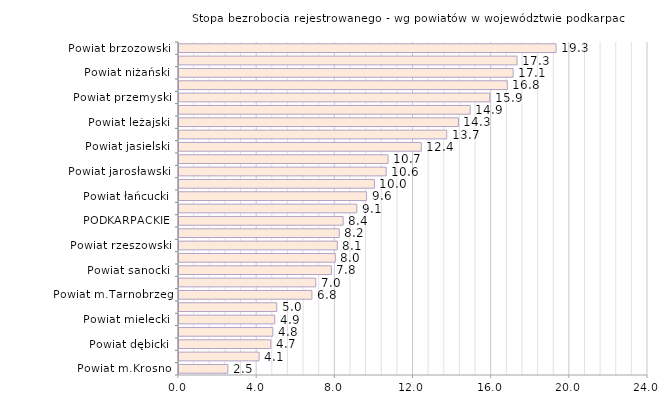
| Category | Stopa bezrobocia rejestrowanego - wg powiatów w województwie podkarpackim |
|---|---|
| Powiat m.Krosno | 2.5 |
| Powiat m.Rzeszów | 4.1 |
| Powiat dębicki | 4.7 |
| Powiat stalowowolski | 4.8 |
| Powiat mielecki | 4.9 |
| POLSKA | 5 |
| Powiat m.Tarnobrzeg | 6.8 |
| Powiat tarnobrzeski | 7 |
| Powiat sanocki | 7.8 |
| Powiat krośnieński | 8 |
| Powiat rzeszowski | 8.1 |
| Powiat kolbuszowski | 8.2 |
| PODKARPACKIE | 8.4 |
| Powiat m.Przemyśl | 9.1 |
| Powiat łańcucki | 9.6 |
| Powiat lubaczowski | 10 |
| Powiat jarosławski | 10.6 |
| Powiat ropczycko-sędziszowski | 10.7 |
| Powiat jasielski | 12.4 |
| Powiat przeworski | 13.7 |
| Powiat leżajski | 14.3 |
| Powiat bieszczadzki | 14.9 |
| Powiat przemyski | 15.9 |
| Powiat strzyżowski | 16.8 |
| Powiat niżański | 17.1 |
| Powiat leski | 17.3 |
| Powiat brzozowski | 19.3 |